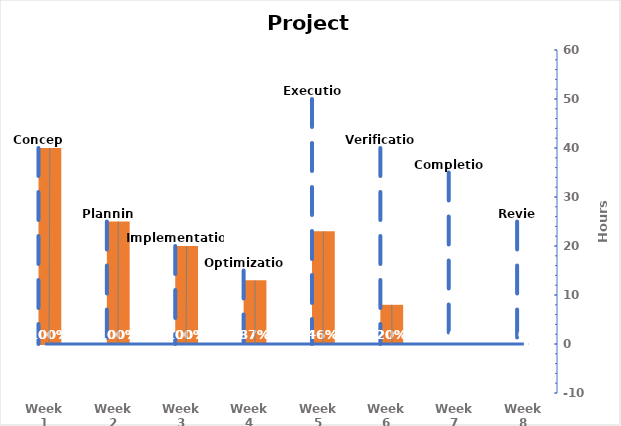
| Category | Hours | Hours Spent |
|---|---|---|
| 0 | 40 | 40 |
| 1 | 25 | 25 |
| 2 | 20 | 20 |
| 3 | 15 | 13 |
| 4 | 50 | 23 |
| 5 | 40 | 8 |
| 6 | 35 | 0 |
| 7 | 25 | 0 |